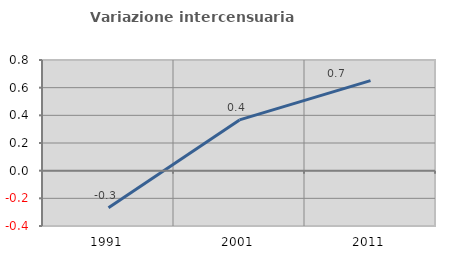
| Category | Variazione intercensuaria annua |
|---|---|
| 1991.0 | -0.268 |
| 2001.0 | 0.367 |
| 2011.0 | 0.651 |